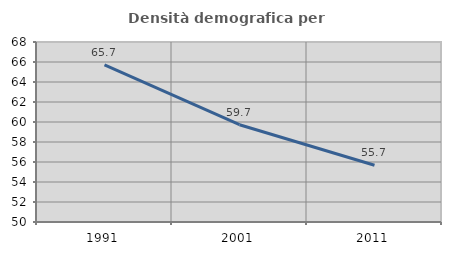
| Category | Densità demografica |
|---|---|
| 1991.0 | 65.716 |
| 2001.0 | 59.726 |
| 2011.0 | 55.676 |